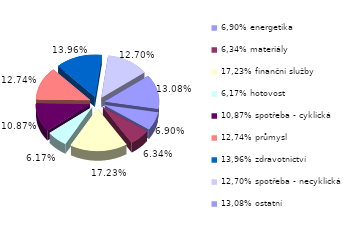
| Category | Series 0 |
|---|---|
| 6,90% energetika | 0.069 |
| 6,34% materiály | 0.063 |
| 17,23% finanční služby | 0.172 |
| 6,17% hotovost | 0.062 |
| 10,87% spotřeba - cyklická | 0.109 |
| 12,74% průmysl | 0.127 |
| 13,96% zdravotnictví | 0.14 |
| 12,70% spotřeba - necyklická | 0.127 |
| 13,08% ostatní | 0.131 |